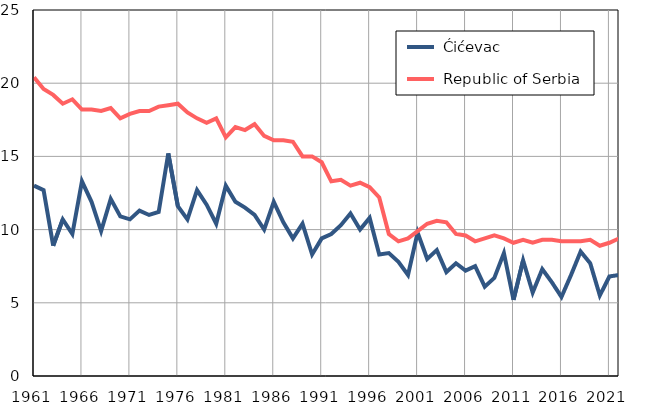
| Category |  Ćićevac |  Republic of Serbia |
|---|---|---|
| 1961.0 | 13 | 20.4 |
| 1962.0 | 12.7 | 19.6 |
| 1963.0 | 8.9 | 19.2 |
| 1964.0 | 10.7 | 18.6 |
| 1965.0 | 9.7 | 18.9 |
| 1966.0 | 13.3 | 18.2 |
| 1967.0 | 11.9 | 18.2 |
| 1968.0 | 9.9 | 18.1 |
| 1969.0 | 12.1 | 18.3 |
| 1970.0 | 10.9 | 17.6 |
| 1971.0 | 10.7 | 17.9 |
| 1972.0 | 11.3 | 18.1 |
| 1973.0 | 11 | 18.1 |
| 1974.0 | 11.2 | 18.4 |
| 1975.0 | 15.2 | 18.5 |
| 1976.0 | 11.6 | 18.6 |
| 1977.0 | 10.7 | 18 |
| 1978.0 | 12.7 | 17.6 |
| 1979.0 | 11.7 | 17.3 |
| 1980.0 | 10.4 | 17.6 |
| 1981.0 | 13 | 16.3 |
| 1982.0 | 11.9 | 17 |
| 1983.0 | 11.5 | 16.8 |
| 1984.0 | 11 | 17.2 |
| 1985.0 | 10 | 16.4 |
| 1986.0 | 11.9 | 16.1 |
| 1987.0 | 10.5 | 16.1 |
| 1988.0 | 9.4 | 16 |
| 1989.0 | 10.4 | 15 |
| 1990.0 | 8.3 | 15 |
| 1991.0 | 9.4 | 14.6 |
| 1992.0 | 9.7 | 13.3 |
| 1993.0 | 10.3 | 13.4 |
| 1994.0 | 11.1 | 13 |
| 1995.0 | 10 | 13.2 |
| 1996.0 | 10.8 | 12.9 |
| 1997.0 | 8.3 | 12.2 |
| 1998.0 | 8.4 | 9.7 |
| 1999.0 | 7.8 | 9.2 |
| 2000.0 | 6.9 | 9.4 |
| 2001.0 | 9.8 | 9.9 |
| 2002.0 | 8 | 10.4 |
| 2003.0 | 8.6 | 10.6 |
| 2004.0 | 7.1 | 10.5 |
| 2005.0 | 7.7 | 9.7 |
| 2006.0 | 7.2 | 9.6 |
| 2007.0 | 7.5 | 9.2 |
| 2008.0 | 6.1 | 9.4 |
| 2009.0 | 6.7 | 9.6 |
| 2010.0 | 8.4 | 9.4 |
| 2011.0 | 5.2 | 9.1 |
| 2012.0 | 7.9 | 9.3 |
| 2013.0 | 5.7 | 9.1 |
| 2014.0 | 7.3 | 9.3 |
| 2015.0 | 6.4 | 9.3 |
| 2016.0 | 5.4 | 9.2 |
| 2017.0 | 6.9 | 9.2 |
| 2018.0 | 8.5 | 9.2 |
| 2019.0 | 7.7 | 9.3 |
| 2020.0 | 5.5 | 8.9 |
| 2021.0 | 6.8 | 9.1 |
| 2022.0 | 6.9 | 9.4 |